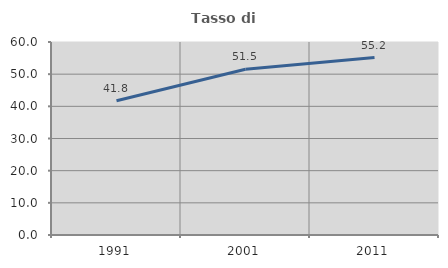
| Category | Tasso di occupazione   |
|---|---|
| 1991.0 | 41.758 |
| 2001.0 | 51.546 |
| 2011.0 | 55.172 |